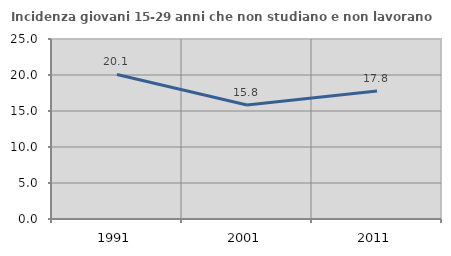
| Category | Incidenza giovani 15-29 anni che non studiano e non lavorano  |
|---|---|
| 1991.0 | 20.079 |
| 2001.0 | 15.842 |
| 2011.0 | 17.791 |